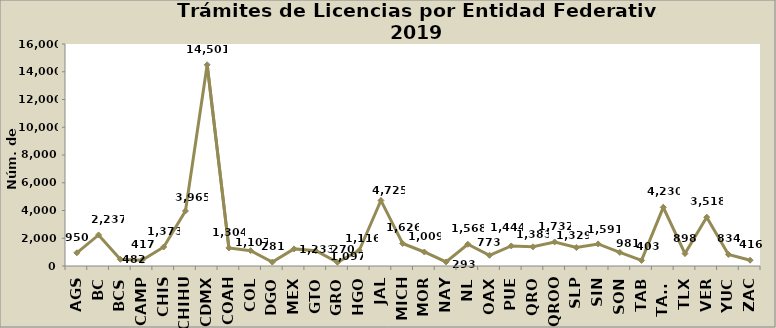
| Category | Series 0 |
|---|---|
| AGS | 950 |
| BC | 2237 |
| BCS | 482 |
| CAMP | 417 |
| CHIS | 1373 |
| CHIHU | 3965 |
| CDMX | 14501 |
| COAH | 1304 |
| COL | 1107 |
| DGO | 281 |
| MEX | 1233 |
| GTO | 1097 |
| GRO | 270 |
| HGO | 1116 |
| JAL | 4725 |
| MICH | 1626 |
| MOR | 1009 |
| NAY | 293 |
| NL | 1568 |
| OAX | 773 |
| PUE | 1444 |
| QRO | 1383 |
| QROO | 1732 |
| SLP | 1329 |
| SIN | 1591 |
| SON | 981 |
| TAB | 403 |
| TAMS | 4230 |
| TLX | 898 |
| VER | 3518 |
| YUC | 834 |
| ZAC | 416 |